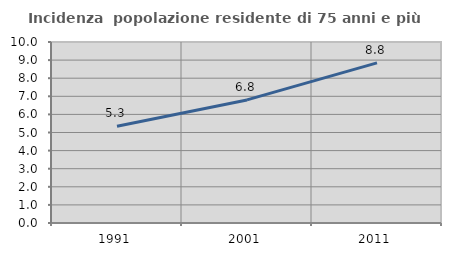
| Category | Incidenza  popolazione residente di 75 anni e più |
|---|---|
| 1991.0 | 5.347 |
| 2001.0 | 6.8 |
| 2011.0 | 8.844 |